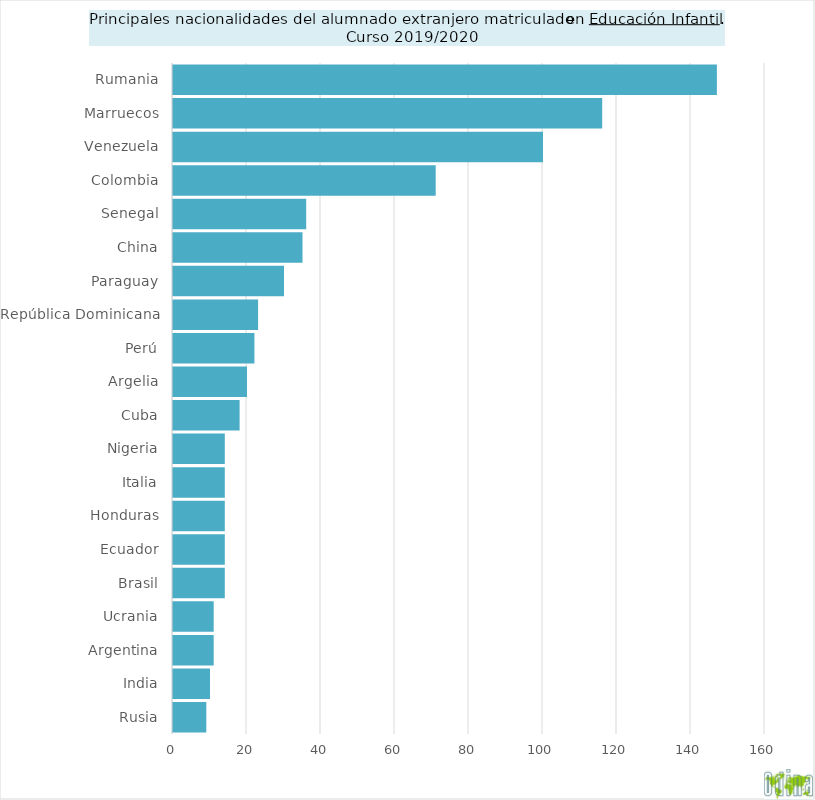
| Category | TOTAL |
|---|---|
| Rusia | 9 |
| India | 10 |
| Argentina | 11 |
| Ucrania | 11 |
| Brasil | 14 |
| Ecuador | 14 |
| Honduras | 14 |
| Italia | 14 |
| Nigeria | 14 |
| Cuba | 18 |
| Argelia | 20 |
| Perú | 22 |
| República Dominicana | 23 |
| Paraguay | 30 |
| China | 35 |
| Senegal | 36 |
| Colombia | 71 |
| Venezuela | 100 |
| Marruecos | 116 |
| Rumania | 147 |